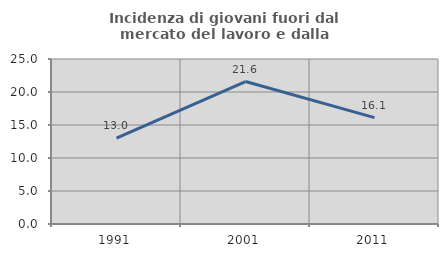
| Category | Incidenza di giovani fuori dal mercato del lavoro e dalla formazione  |
|---|---|
| 1991.0 | 13.021 |
| 2001.0 | 21.583 |
| 2011.0 | 16.114 |